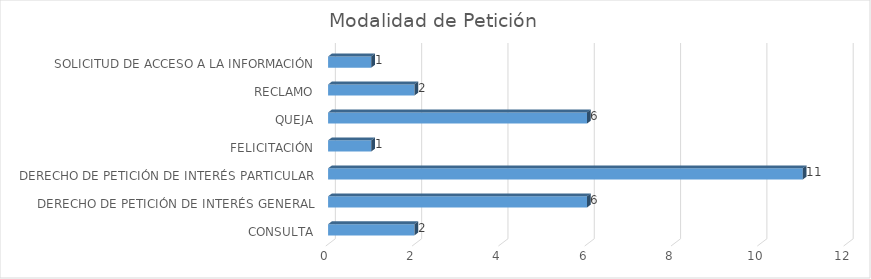
| Category | Total |
|---|---|
| CONSULTA | 2 |
| DERECHO DE PETICIÓN DE INTERÉS GENERAL | 6 |
| DERECHO DE PETICIÓN DE INTERÉS PARTICULAR | 11 |
| FELICITACIÓN | 1 |
| QUEJA | 6 |
| RECLAMO | 2 |
| SOLICITUD DE ACCESO A LA INFORMACIÓN | 1 |